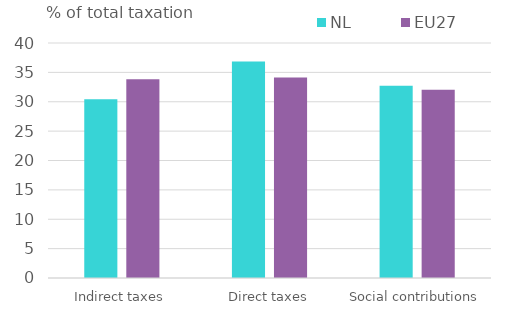
| Category | NL | EU27 |
|---|---|---|
| Indirect taxes | 30.428 | 33.811 |
| Direct taxes | 36.835 | 34.133 |
| Social contributions | 32.737 | 32.056 |